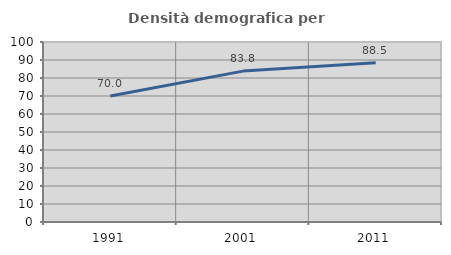
| Category | Densità demografica |
|---|---|
| 1991.0 | 69.952 |
| 2001.0 | 83.831 |
| 2011.0 | 88.458 |